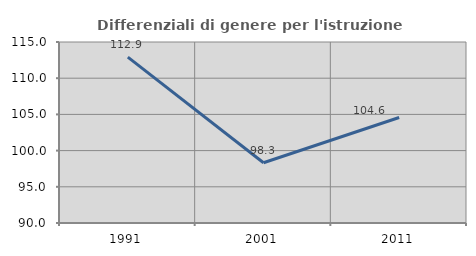
| Category | Differenziali di genere per l'istruzione superiore |
|---|---|
| 1991.0 | 112.915 |
| 2001.0 | 98.318 |
| 2011.0 | 104.577 |